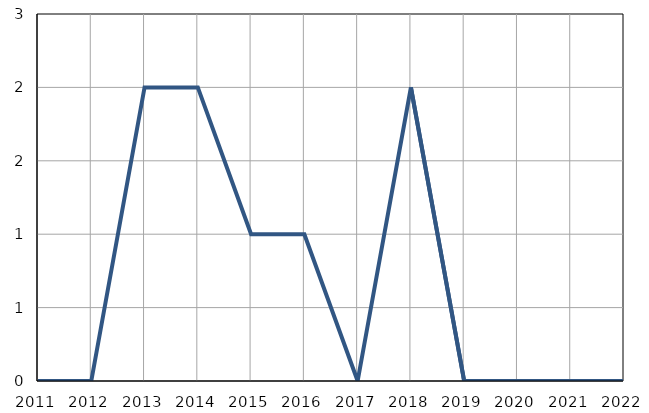
| Category | Infants
deaths |
|---|---|
| 2011.0 | 0 |
| 2012.0 | 0 |
| 2013.0 | 2 |
| 2014.0 | 2 |
| 2015.0 | 1 |
| 2016.0 | 1 |
| 2017.0 | 0 |
| 2018.0 | 2 |
| 2019.0 | 0 |
| 2020.0 | 0 |
| 2021.0 | 0 |
| 2022.0 | 0 |